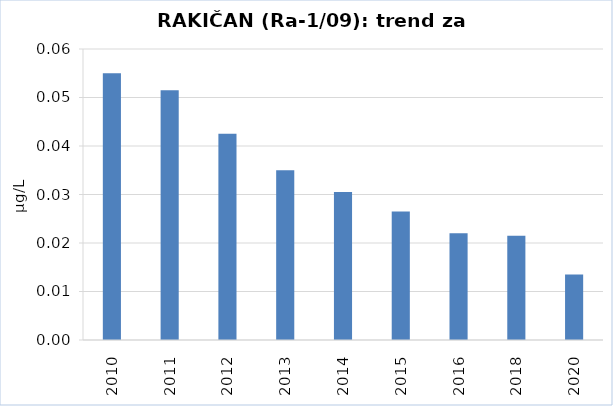
| Category | Vsota |
|---|---|
| 2010 | 0.055 |
| 2011 | 0.052 |
| 2012 | 0.042 |
| 2013 | 0.035 |
| 2014 | 0.03 |
| 2015 | 0.026 |
| 2016 | 0.022 |
| 2018 | 0.022 |
| 2020 | 0.014 |